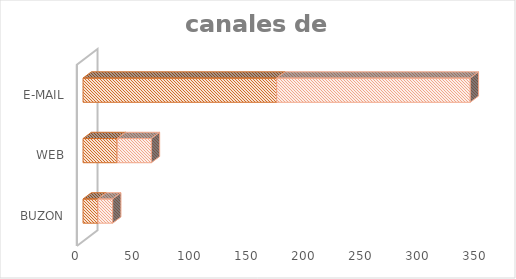
| Category | Cuenta de Número petición | Cuenta de Número petición2 |
|---|---|---|
| BUZON | 13 | 13 |
| WEB | 30 | 30 |
| E-MAIL | 170 | 170 |